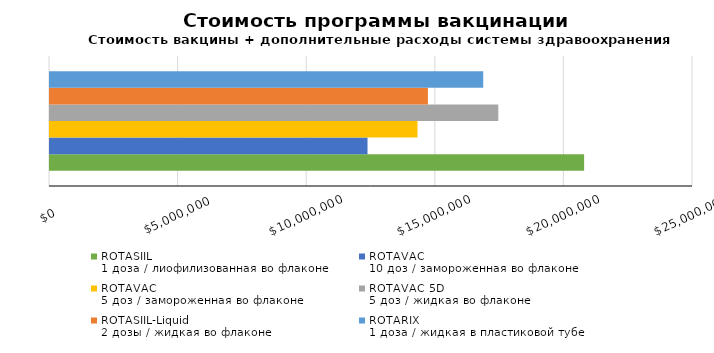
| Category | ROTASIIL
1 доза / лиофилизованная во флаконе | ROTAVAC
10 доз / замороженная во флаконе | ROTAVAC
5 доз / замороженная во флаконе | ROTAVAC 5D
5 доз / жидкая во флаконе | ROTASIIL-Liquid
2 дозы / жидкая во флаконе | ROTARIX
1 доза / жидкая в пластиковой тубе |
|---|---|---|---|---|---|---|
| Всего
на 5 лет | 20767043.403 | 12345194.441 | 14289172.944 | 17430081.168 | 14693122.326 | 16843527.882 |